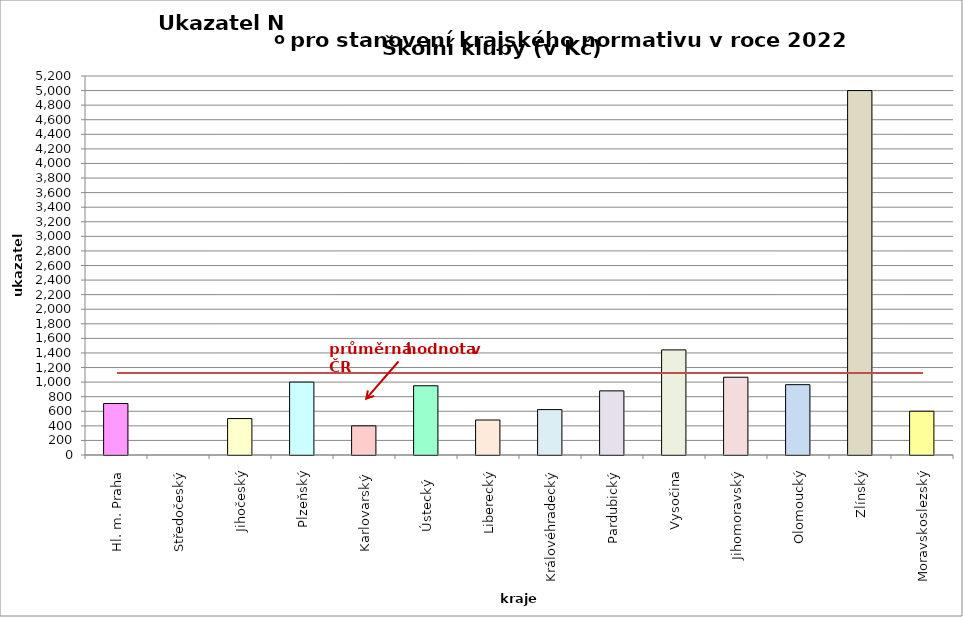
| Category | Series 0 |
|---|---|
| Hl. m. Praha | 706.31 |
| Středočeský | 0 |
| Jihočeský | 500 |
| Plzeňský | 1000 |
| Karlovarský  | 400 |
| Ústecký   | 950 |
| Liberecký | 480 |
| Královéhradecký | 622.89 |
| Pardubický | 880 |
| Vysočina | 1442 |
| Jihomoravský | 1067 |
| Olomoucký | 965 |
| Zlínský | 5000 |
| Moravskoslezský | 600.6 |